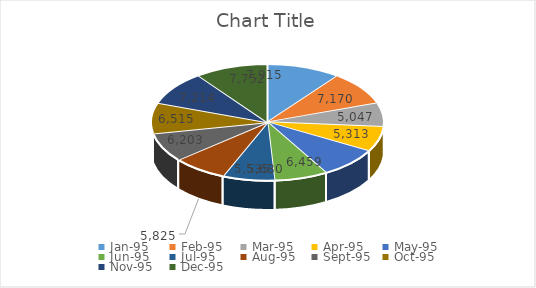
| Category | Series 0 |
|---|---|
| 34700.0 | 7915 |
| 34731.0 | 7170 |
| 34759.0 | 5047 |
| 34790.0 | 5313 |
| 34820.0 | 6459 |
| 34851.0 | 5680 |
| 34881.0 | 5535 |
| 34912.0 | 5825 |
| 34943.0 | 6203 |
| 34973.0 | 6515 |
| 35004.0 | 7214 |
| 35034.0 | 7752 |